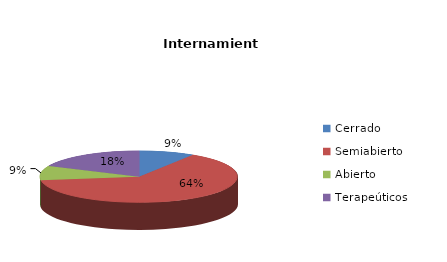
| Category | Series 0 |
|---|---|
| Cerrado | 1 |
| Semiabierto | 7 |
| Abierto | 1 |
| Terapeúticos | 2 |